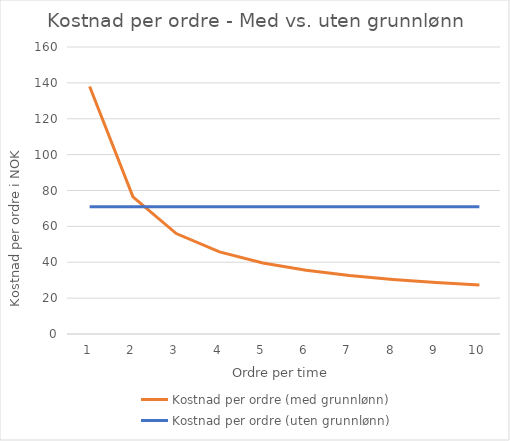
| Category | Kostnad per ordre (med grunnlønn) | Kostnad per ordre (uten grunnlønn) |
|---|---|---|
| 0 | 138 | 71 |
| 1 | 76.5 | 71 |
| 2 | 56 | 71 |
| 3 | 45.75 | 71 |
| 4 | 39.6 | 71 |
| 5 | 35.5 | 71 |
| 6 | 32.571 | 71 |
| 7 | 30.375 | 71 |
| 8 | 28.667 | 71 |
| 9 | 27.3 | 71 |